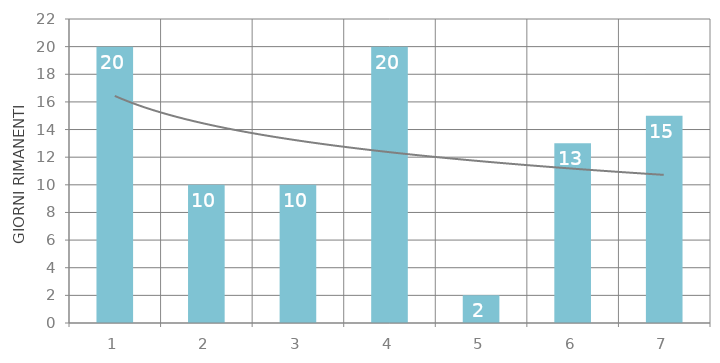
| Category | Totale |
|---|---|
| 1 | 20 |
| 2 | 10 |
| 3 | 10 |
| 4 | 20 |
| 5 | 2 |
| 6 | 13 |
| 7 | 15 |